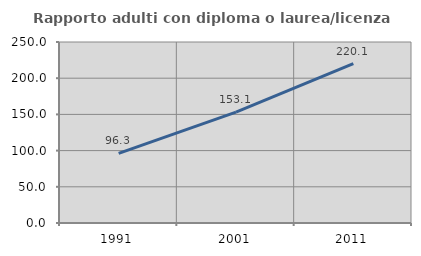
| Category | Rapporto adulti con diploma o laurea/licenza media  |
|---|---|
| 1991.0 | 96.281 |
| 2001.0 | 153.059 |
| 2011.0 | 220.142 |